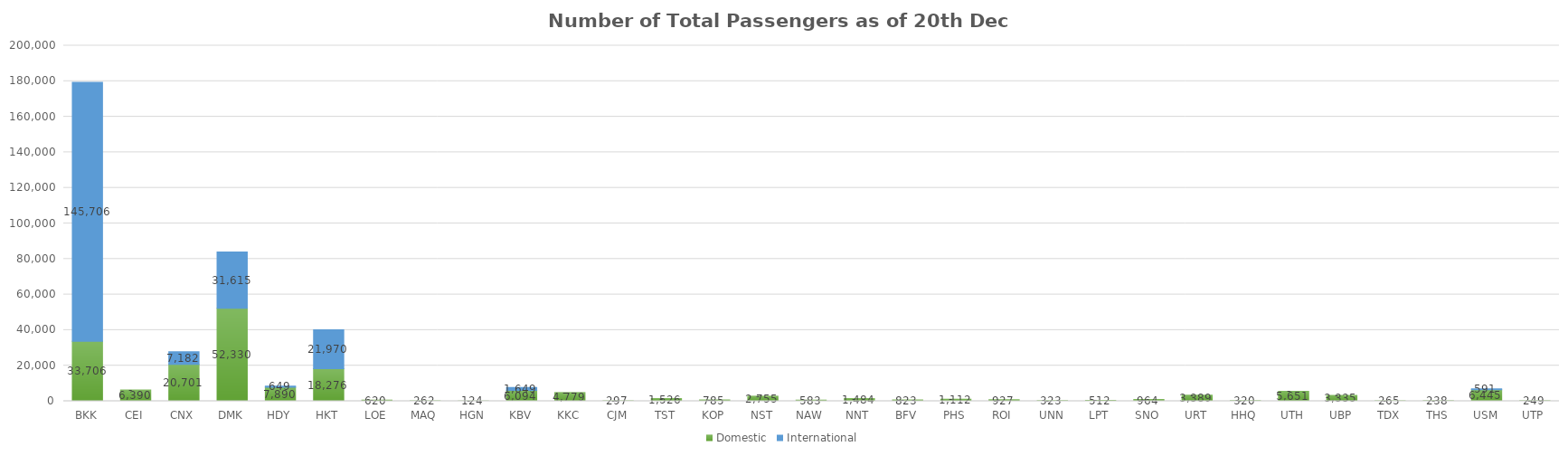
| Category | Domestic | International |
|---|---|---|
| BKK | 33706 | 145706 |
| CEI | 6390 | 0 |
| CNX | 20701 | 7182 |
| DMK | 52330 | 31615 |
| HDY | 7890 | 649 |
| HKT | 18276 | 21970 |
| LOE | 620 | 0 |
| MAQ | 262 | 0 |
| HGN | 124 | 0 |
| KBV | 6094 | 1649 |
| KKC | 4779 | 0 |
| CJM | 297 | 0 |
| TST | 1526 | 0 |
| KOP | 785 | 0 |
| NST | 2755 | 0 |
| NAW | 583 | 0 |
| NNT | 1484 | 0 |
| BFV | 823 | 0 |
| PHS | 1112 | 0 |
| ROI | 927 | 0 |
| UNN | 323 | 0 |
| LPT | 512 | 0 |
| SNO | 964 | 0 |
| URT | 3389 | 0 |
| HHQ | 320 | 0 |
| UTH | 5651 | 0 |
| UBP | 3335 | 0 |
| TDX | 265 | 0 |
| THS | 238 | 0 |
| USM | 6445 | 591 |
| UTP | 249 | 0 |